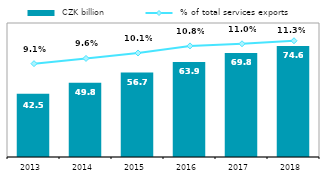
| Category |  CZK billion |
|---|---|
| 2013.0 | 42.511 |
| 2014.0 | 49.811 |
| 2015.0 | 56.69 |
| 2016.0 | 63.867 |
| 2017.0 | 69.78 |
| 2018.0 | 74.573 |